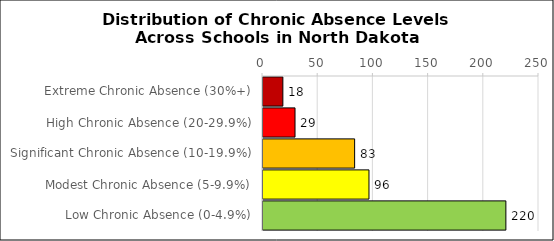
| Category | Number of Schools |
|---|---|
| Extreme Chronic Absence (30%+) | 18 |
| High Chronic Absence (20-29.9%) | 29 |
| Significant Chronic Absence (10-19.9%) | 83 |
| Modest Chronic Absence (5-9.9%) | 96 |
| Low Chronic Absence (0-4.9%) | 220 |